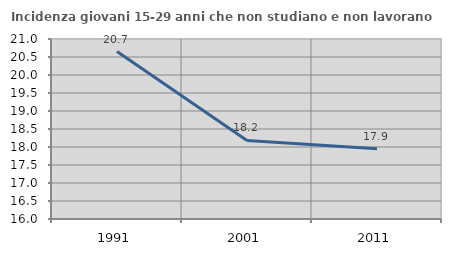
| Category | Incidenza giovani 15-29 anni che non studiano e non lavorano  |
|---|---|
| 1991.0 | 20.652 |
| 2001.0 | 18.182 |
| 2011.0 | 17.949 |